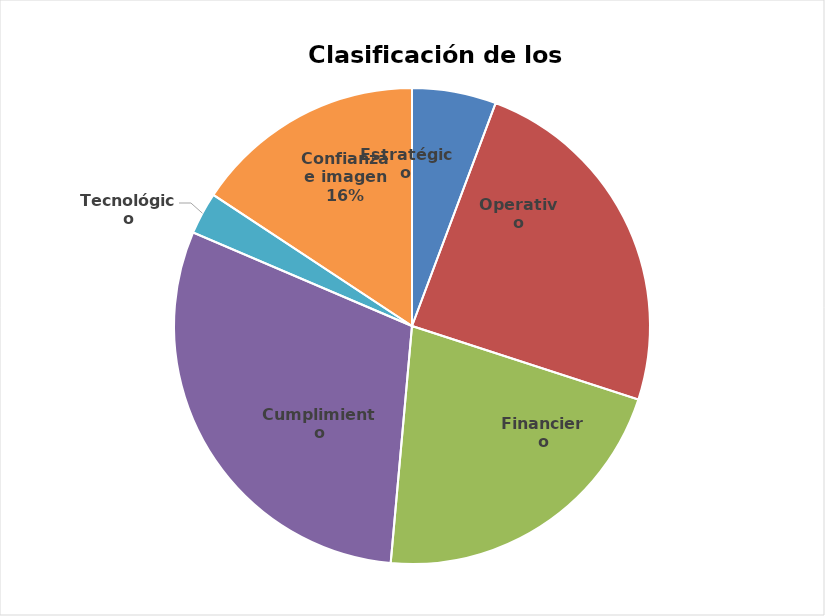
| Category | Series 0 |
|---|---|
| Estratégico | 4 |
| Operativo | 17 |
| Financiero | 15 |
| Cumplimiento | 21 |
| Tecnológico | 2 |
| Confianza e imagen | 11 |